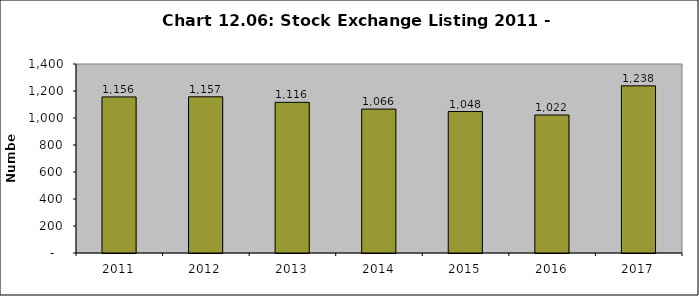
| Category | Series 0 |
|---|---|
| 2011.0 | 1156 |
| 2012.0 | 1157 |
| 2013.0 | 1116 |
| 2014.0 | 1066 |
| 2015.0 | 1048 |
| 2016.0 | 1022 |
| 2017.0 | 1238 |